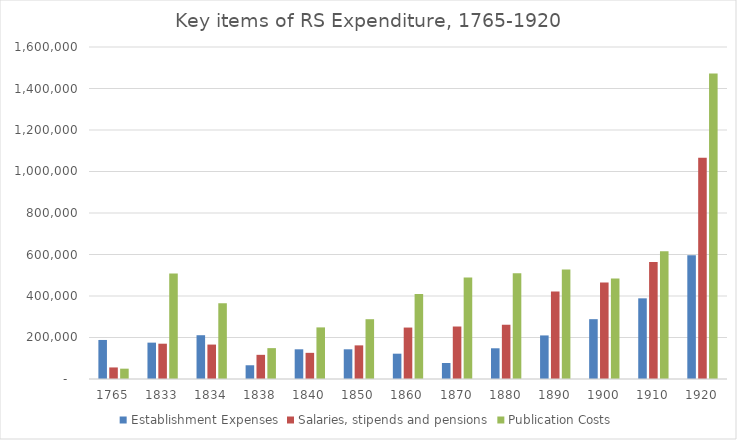
| Category | Establishment Expenses | Salaries, stipends and pensions | Publication Costs |
|---|---|---|---|
| 1765.0 | 188131 | 55680 | 49796 |
| 1833.0 | 175237.5 | 170124 | 508319 |
| 1834.0 | 211017.5 | 165921 | 365064 |
| 1838.0 | 66201 | 116460 | 148769 |
| 1840.0 | 143107 | 126060 | 248676 |
| 1850.0 | 143133 | 162060 | 288123 |
| 1860.0 | 121995 | 247920 | 410136 |
| 1870.0 | 77204 | 252952 | 488814 |
| 1880.0 | 148023 | 261501 | 509215 |
| 1890.0 | 209996 | 421344 | 527234 |
| 1900.0 | 288289 | 464901 | 483972 |
| 1910.0 | 388778 | 564366 | 615168 |
| 1920.0 | 596735 | 1065815 | 1472169 |